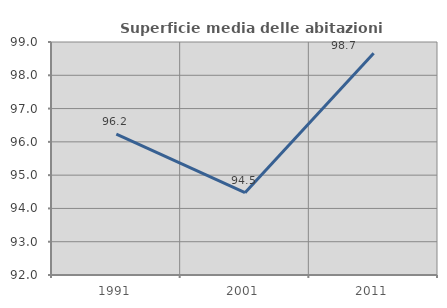
| Category | Superficie media delle abitazioni occupate |
|---|---|
| 1991.0 | 96.232 |
| 2001.0 | 94.472 |
| 2011.0 | 98.662 |